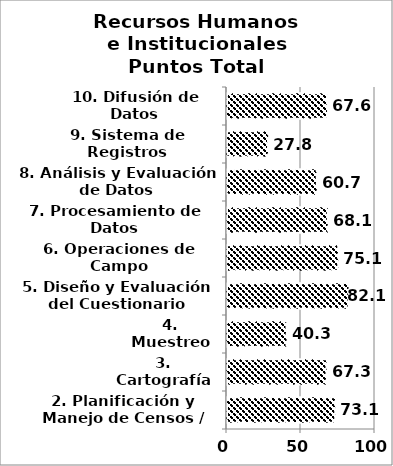
| Category | Series 0 |
|---|---|
| 2. Planificación y Manejo de Censos / Encuestas | 73.081 |
| 3. Cartografía | 67.284 |
| 4. Muestreo | 40.278 |
| 5. Diseño y Evaluación del Cuestionario | 82.143 |
| 6. Operaciones de Campo | 75.133 |
| 7. Procesamiento de Datos | 68.098 |
| 8. Análisis y Evaluación de Datos | 60.678 |
| 9. Sistema de Registros Administrativos | 27.778 |
| 10. Difusión de Datos | 67.593 |